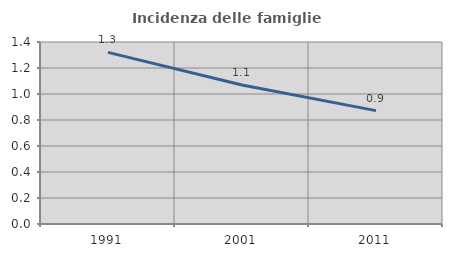
| Category | Incidenza delle famiglie numerose |
|---|---|
| 1991.0 | 1.32 |
| 2001.0 | 1.07 |
| 2011.0 | 0.872 |